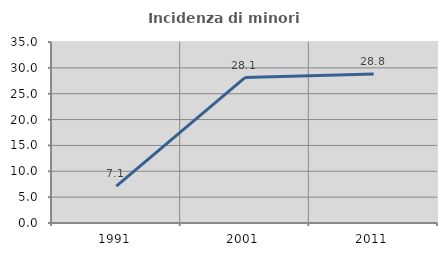
| Category | Incidenza di minori stranieri |
|---|---|
| 1991.0 | 7.143 |
| 2001.0 | 28.125 |
| 2011.0 | 28.827 |